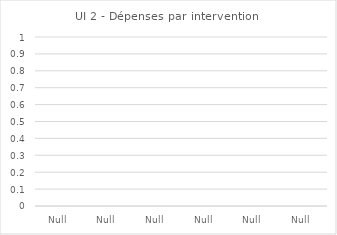
| Category | IU3 interventions |
|---|---|
| Null | 0 |
| Null | 0 |
| Null | 0 |
| Null | 0 |
| Null | 0 |
| Null | 0 |